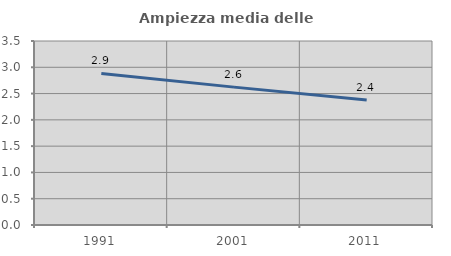
| Category | Ampiezza media delle famiglie |
|---|---|
| 1991.0 | 2.884 |
| 2001.0 | 2.623 |
| 2011.0 | 2.38 |